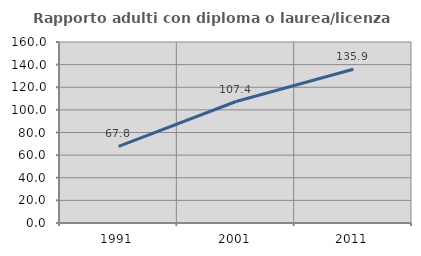
| Category | Rapporto adulti con diploma o laurea/licenza media  |
|---|---|
| 1991.0 | 67.819 |
| 2001.0 | 107.394 |
| 2011.0 | 135.859 |